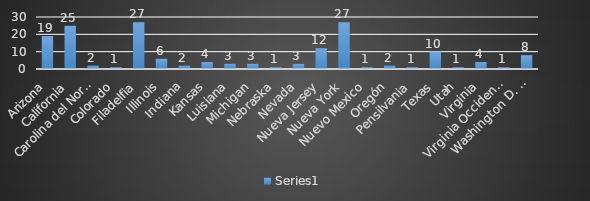
| Category | Series 0 |
|---|---|
| Arizona | 19 |
| California | 25 |
| Carolina del Norte | 2 |
| Colorado | 1 |
| Filadelfia | 27 |
| Illinois | 6 |
| Indiana | 2 |
| Kansas | 4 |
| Luisiana | 3 |
| Michigan | 3 |
| Nebraska | 1 |
| Nevada | 3 |
| Nueva Jersey | 12 |
| Nueva York | 27 |
| Nuevo Mexico | 1 |
| Oregón | 2 |
| Pensilvania | 1 |
| Texas | 10 |
| Utah | 1 |
| Virginia | 4 |
| Virginia Occidental | 1 |
| Washington D. C. | 8 |